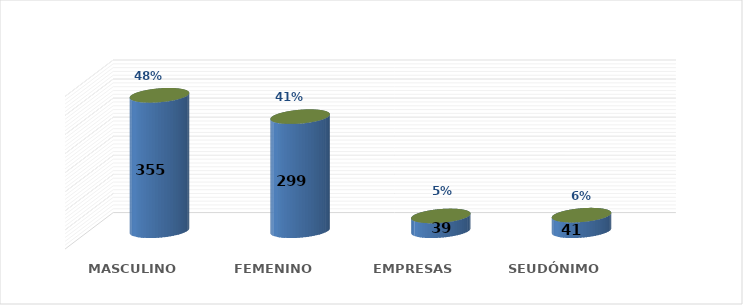
| Category | SOLICITUD POR GÉNERO | Series 1 |
|---|---|---|
| MASCULINO | 355 | 0.484 |
| FEMENINO | 299 | 0.407 |
| EMPRESAS | 39 | 0.053 |
| SEUDÓNIMO | 41 | 0.056 |